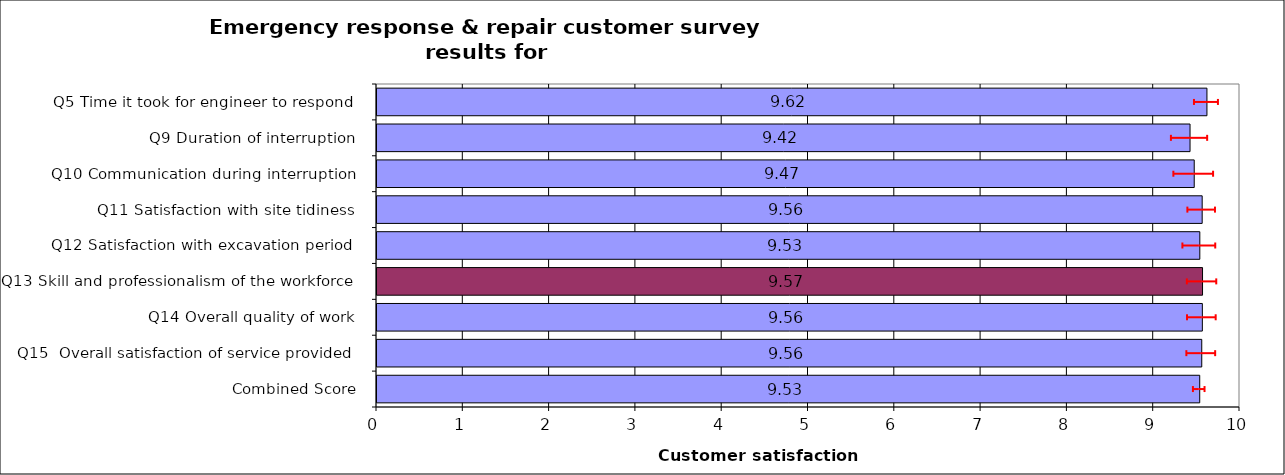
| Category | Series 0 |
|---|---|
| Q5 Time it took for engineer to respond | 9.617 |
| Q9 Duration of interruption | 9.421 |
| Q10 Communication during interruption | 9.47 |
| Q11 Satisfaction with site tidiness | 9.562 |
| Q12 Satisfaction with excavation period | 9.534 |
| Q13 Skill and professionalism of the workforce | 9.566 |
| Q14 Overall quality of work | 9.564 |
| Q15  Overall satisfaction of service provided | 9.557 |
| Combined Score | 9.533 |